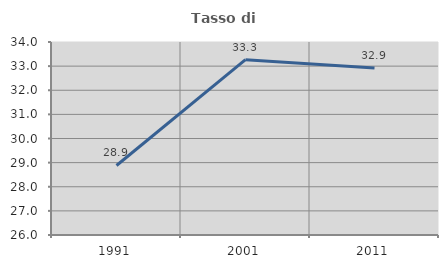
| Category | Tasso di occupazione   |
|---|---|
| 1991.0 | 28.881 |
| 2001.0 | 33.266 |
| 2011.0 | 32.924 |